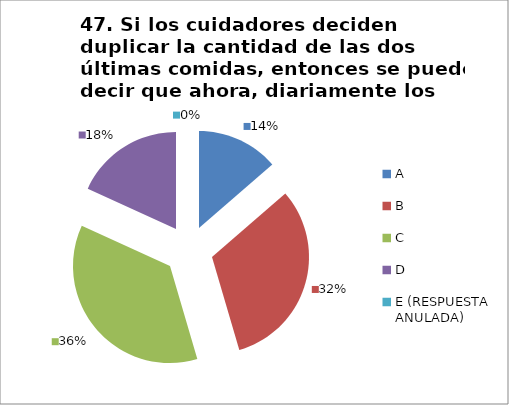
| Category | CANTIDAD DE RESPUESTAS PREGUNTA (47) | PORCENTAJE |
|---|---|---|
| A | 3 | 0.136 |
| B | 7 | 0.318 |
| C | 8 | 0.364 |
| D | 4 | 0.182 |
| E (RESPUESTA ANULADA) | 0 | 0 |